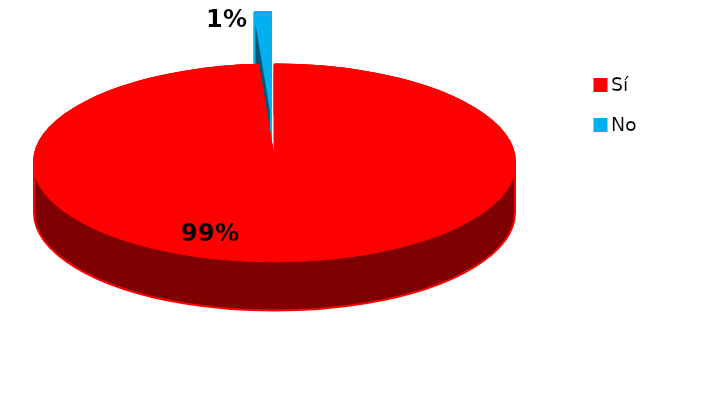
| Category | Series 0 |
|---|---|
| 0 | 91 |
| 1 | 1 |